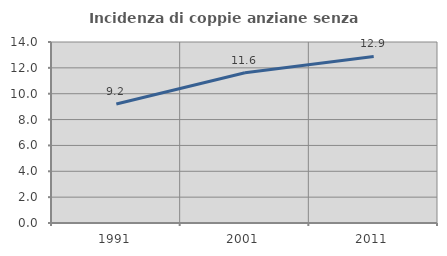
| Category | Incidenza di coppie anziane senza figli  |
|---|---|
| 1991.0 | 9.199 |
| 2001.0 | 11.618 |
| 2011.0 | 12.884 |